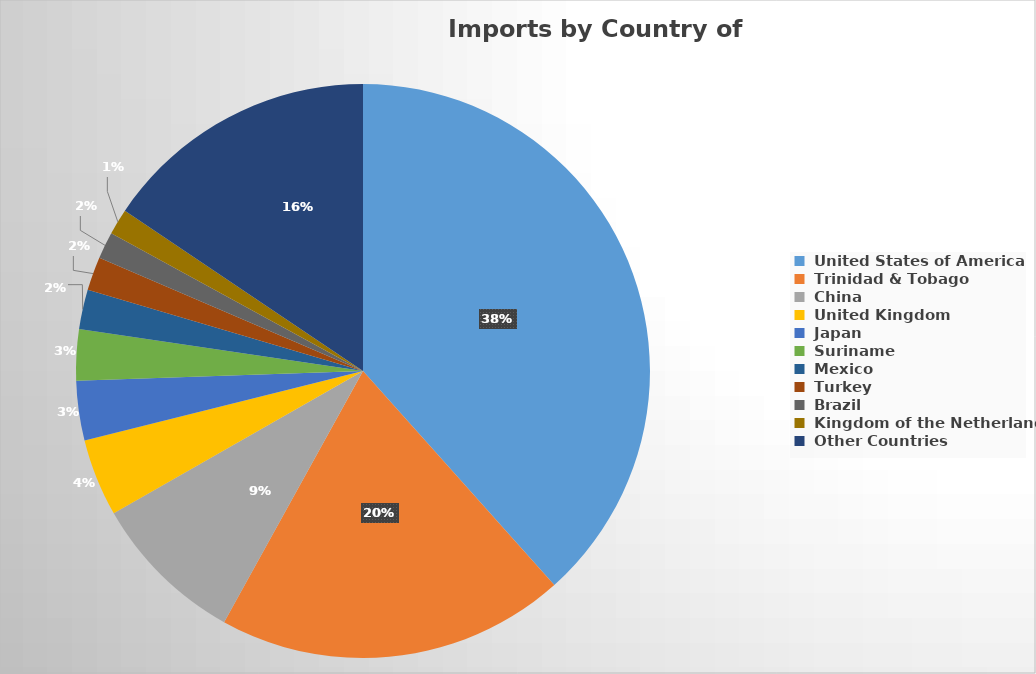
| Category | Series 0 |
|---|---|
| United States of America | 232989.852 |
| Trinidad & Tobago | 119274.364 |
| China | 52819.359 |
| United Kingdom | 26500.511 |
| Japan | 20341.075 |
| Suriname | 17456.816 |
| Mexico | 13511.352 |
| Turkey | 11507.081 |
| Brazil | 9171.57 |
| Kingdom of the Netherlands | 8847.036 |
| Other Countries | 94508.117 |